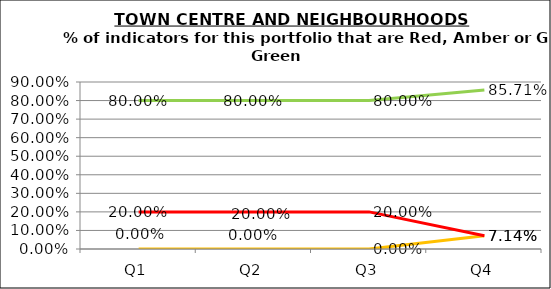
| Category | Green | Amber | Red |
|---|---|---|---|
| Q1 | 0.8 | 0 | 0.2 |
| Q2 | 0.8 | 0 | 0.2 |
| Q3 | 0.8 | 0 | 0.2 |
| Q4 | 0.857 | 0.071 | 0.071 |